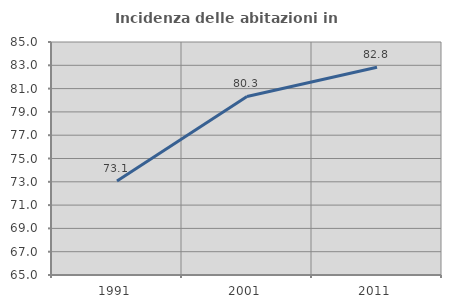
| Category | Incidenza delle abitazioni in proprietà  |
|---|---|
| 1991.0 | 73.077 |
| 2001.0 | 80.323 |
| 2011.0 | 82.836 |